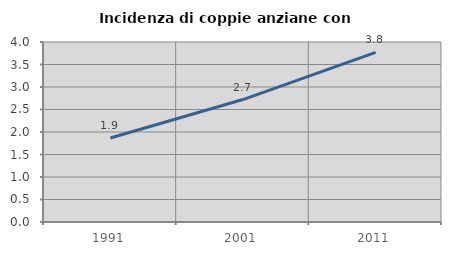
| Category | Incidenza di coppie anziane con figli |
|---|---|
| 1991.0 | 1.866 |
| 2001.0 | 2.721 |
| 2011.0 | 3.768 |